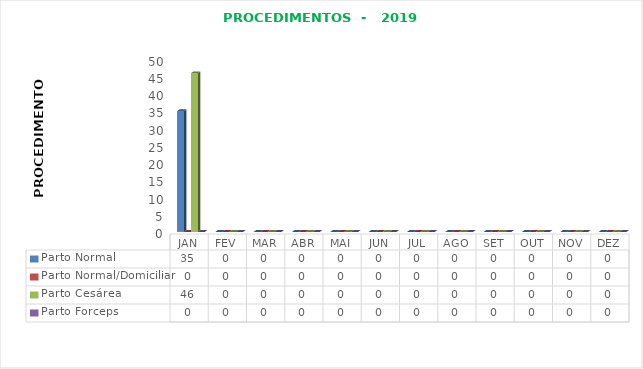
| Category | Parto Normal | Parto Normal/Domiciliar | Parto Cesárea | Parto Forceps |
|---|---|---|---|---|
| JAN | 35 | 0 | 46 | 0 |
| FEV | 0 | 0 | 0 | 0 |
| MAR | 0 | 0 | 0 | 0 |
| ABR | 0 | 0 | 0 | 0 |
| MAI | 0 | 0 | 0 | 0 |
| JUN | 0 | 0 | 0 | 0 |
| JUL | 0 | 0 | 0 | 0 |
| AGO | 0 | 0 | 0 | 0 |
| SET | 0 | 0 | 0 | 0 |
| OUT | 0 | 0 | 0 | 0 |
| NOV | 0 | 0 | 0 | 0 |
| DEZ | 0 | 0 | 0 | 0 |